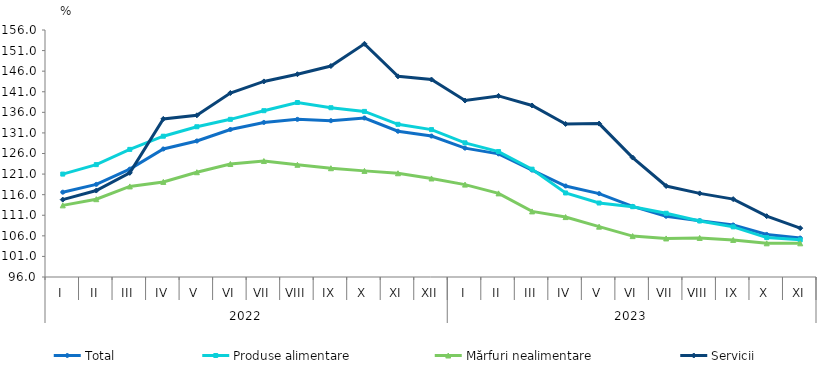
| Category | Total  | Produse alimentare | Mărfuri nealimentare  | Servicii |
|---|---|---|---|---|
| 0 | 116.6 | 121 | 113.4 | 114.8 |
| 1 | 118.5 | 123.3 | 114.9 | 117 |
| 2 | 122.2 | 127 | 118 | 121.3 |
| 3 | 127.1 | 130.2 | 119.1 | 134.4 |
| 4 | 129.047 | 132.5 | 121.45 | 135.267 |
| 5 | 131.827 | 134.301 | 123.443 | 140.701 |
| 6 | 133.547 | 136.399 | 124.168 | 143.511 |
| 7 | 134.294 | 138.387 | 123.256 | 145.253 |
| 8 | 133.971 | 137.121 | 122.424 | 147.248 |
| 9 | 134.625 | 136.226 | 121.779 | 152.646 |
| 10 | 131.406 | 133.093 | 121.201 | 144.742 |
| 11 | 130.241 | 131.801 | 119.936 | 143.965 |
| 12 | 127.307 | 128.59 | 118.441 | 138.865 |
| 13 | 125.91 | 126.47 | 116.31 | 139.99 |
| 14 | 121.977 | 122.19 | 111.932 | 137.666 |
| 15 | 118.102 | 116.414 | 110.554 | 133.178 |
| 16 | 116.262 | 113.97 | 108.228 | 133.268 |
| 17 | 113.152 | 113.076 | 105.931 | 125.017 |
| 18 | 110.755 | 111.48 | 105.365 | 118.101 |
| 19 | 109.689 | 109.605 | 105.486 | 116.313 |
| 20 | 108.634 | 108.179 | 105.004 | 114.916 |
| 21 | 106.342 | 105.575 | 104.182 | 110.77 |
| 22 | 105.453 | 105.022 | 104.182 | 107.863 |